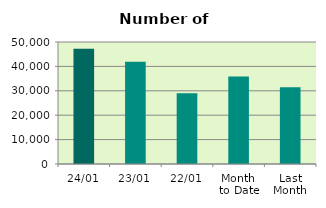
| Category | Series 0 |
|---|---|
| 24/01 | 47190 |
| 23/01 | 41944 |
| 22/01 | 28974 |
| Month 
to Date | 35869.176 |
| Last
Month | 31497.9 |